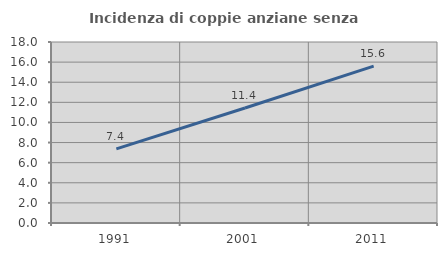
| Category | Incidenza di coppie anziane senza figli  |
|---|---|
| 1991.0 | 7.368 |
| 2001.0 | 11.439 |
| 2011.0 | 15.6 |